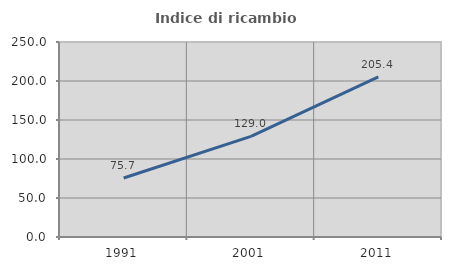
| Category | Indice di ricambio occupazionale  |
|---|---|
| 1991.0 | 75.676 |
| 2001.0 | 129.032 |
| 2011.0 | 205.357 |